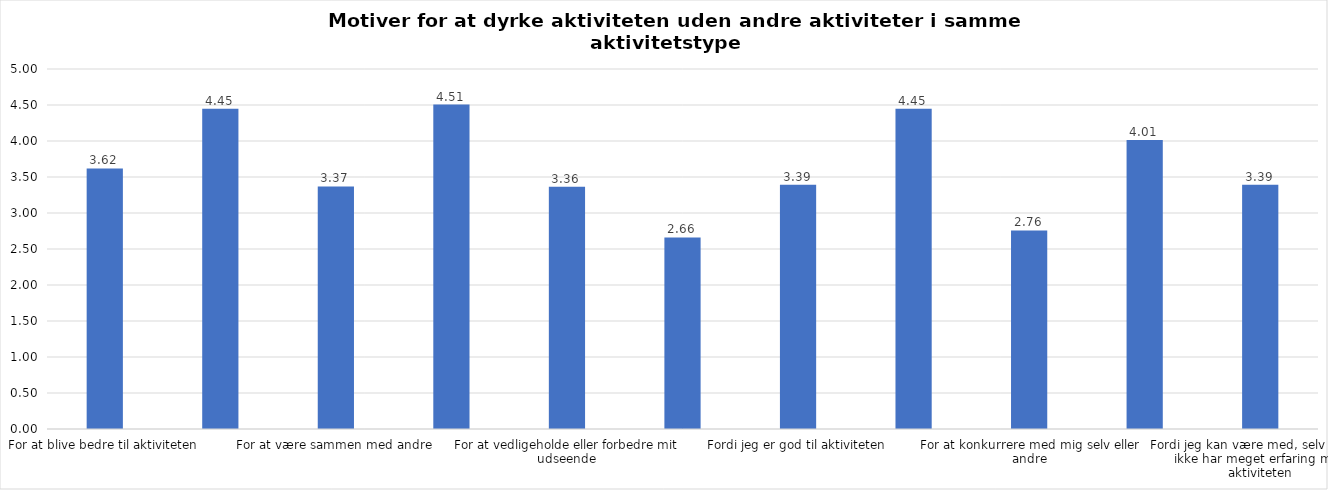
| Category | Gennemsnit |
|---|---|
| For at blive bedre til aktiviteten | 3.619 |
| For at vedligeholde eller forbedre min sundhed (fx helbred, fysisk form) | 4.447 |
| For at være sammen med andre | 3.369 |
| For at gøre noget godt for mig selv | 4.506 |
| For at vedligeholde eller forbedre mit udseende | 3.363 |
| Fordi andre i min omgangskreds opmuntrer mig til det | 2.661 |
| Fordi jeg er god til aktiviteten | 3.392 |
| Fordi jeg godt kan lide aktiviteten | 4.446 |
| For at konkurrere med mig selv eller andre | 2.758 |
| Fordi aktiviteten passer godt ind i min hverdag | 4.014 |
| Fordi jeg kan være med, selv om jeg ikke har meget erfaring med aktiviteten | 3.391 |